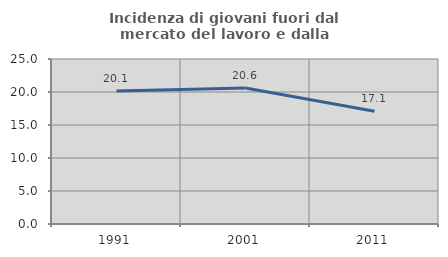
| Category | Incidenza di giovani fuori dal mercato del lavoro e dalla formazione  |
|---|---|
| 1991.0 | 20.139 |
| 2001.0 | 20.596 |
| 2011.0 | 17.069 |